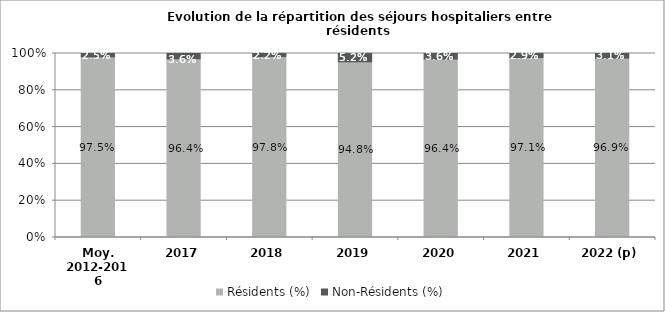
| Category | Résidents (%) | Non-Résidents (%) |
|---|---|---|
| Moy. 2012-2016 | 0.975 | 0.025 |
| 2017 | 0.964 | 0.036 |
| 2018 | 0.978 | 0.022 |
| 2019 | 0.948 | 0.052 |
| 2020 | 0.964 | 0.036 |
| 2021 | 0.971 | 0.029 |
| 2022 (p) | 0.969 | 0.031 |